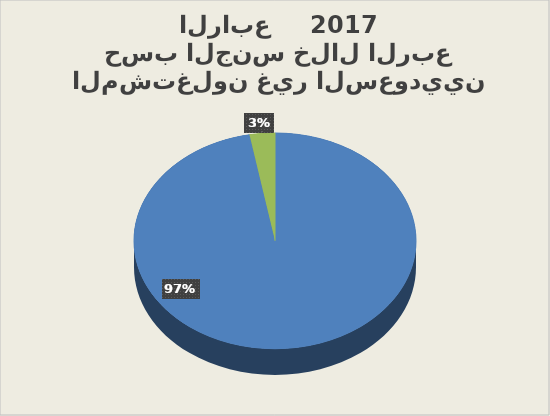
| Category | Series 0 |
|---|---|
| ذكور    | 4466397 |
| أناث | 133358 |